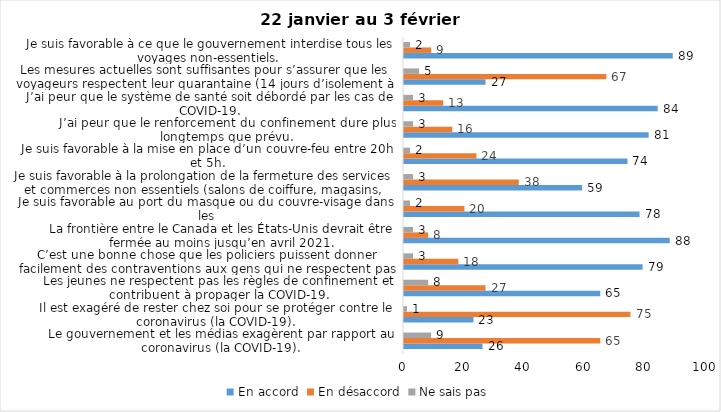
| Category | En accord | En désaccord | Ne sais pas |
|---|---|---|---|
| Le gouvernement et les médias exagèrent par rapport au coronavirus (la COVID-19). | 26 | 65 | 9 |
| Il est exagéré de rester chez soi pour se protéger contre le coronavirus (la COVID-19). | 23 | 75 | 1 |
| Les jeunes ne respectent pas les règles de confinement et contribuent à propager la COVID-19. | 65 | 27 | 8 |
| C’est une bonne chose que les policiers puissent donner facilement des contraventions aux gens qui ne respectent pas les mesures pour prévenir le coronavirus (la COVID-19). | 79 | 18 | 3 |
| La frontière entre le Canada et les États-Unis devrait être fermée au moins jusqu’en avril 2021. | 88 | 8 | 3 |
| Je suis favorable au port du masque ou du couvre-visage dans les
lieux publics extérieurs achalandés (ex. rues, parcs) | 78 | 20 | 2 |
| Je suis favorable à la prolongation de la fermeture des services et commerces non essentiels (salons de coiffure, magasins, industries) jusqu’au 8 février. | 59 | 38 | 3 |
| Je suis favorable à la mise en place d’un couvre-feu entre 20h et 5h. | 74 | 24 | 2 |
| J’ai peur que le renforcement du confinement dure plus longtemps que prévu. | 81 | 16 | 3 |
| J’ai peur que le système de santé soit débordé par les cas de COVID-19. | 84 | 13 | 3 |
| Les mesures actuelles sont suffisantes pour s’assurer que les voyageurs respectent leur quarantaine (14 jours d’isolement à la maison au retour d’un voyage). | 27 | 67 | 5 |
| Je suis favorable à ce que le gouvernement interdise tous les voyages non-essentiels. | 89 | 9 | 2 |